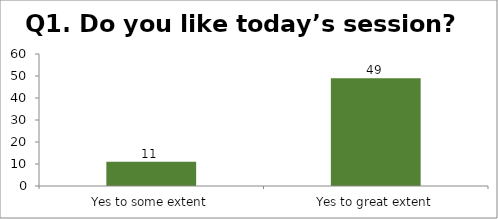
| Category | Q1. Do you like today’s session? |
|---|---|
| Yes to some extent | 11 |
| Yes to great extent | 49 |